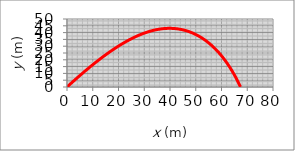
| Category | Series 0 |
|---|---|
| 0.0 | 0 |
| 0.24916666666666673 | 0.431 |
| 0.4966791454179944 | 0.858 |
| 0.7425621269103597 | 1.282 |
| 0.9868397756933099 | 1.701 |
| 1.2295357451129643 | 2.117 |
| 1.470673191690599 | 2.53 |
| 1.710274788998455 | 2.939 |
| 1.9483627410537288 | 3.344 |
| 2.1849587952506972 | 3.745 |
| 2.420084254849969 | 4.144 |
| 2.653759991042943 | 4.538 |
| 2.8860064546087085 | 4.93 |
| 3.1168436871798013 | 5.318 |
| 3.346291332132463 | 5.702 |
| 3.5743686451163335 | 6.084 |
| 3.801094504237806 | 6.462 |
| 4.026487419910634 | 6.837 |
| 4.250565544386745 | 7.209 |
| 4.473346680979654 | 7.577 |
| 4.694848292992279 | 7.943 |
| 4.915087512360473 | 8.305 |
| 5.134081148023058 | 8.665 |
| 5.351845694028667 | 9.021 |
| 5.568397337389285 | 9.375 |
| 5.7837519656898975 | 9.726 |
| 5.997925174463292 | 10.073 |
| 6.2109322743386555 | 10.418 |
| 6.422788297972216 | 10.76 |
| 6.633508006767879 | 11.099 |
| 6.843105897395412 | 11.435 |
| 7.051596208113473 | 11.769 |
| 7.258992924904424 | 12.1 |
| 7.46530978742762 | 12.428 |
| 7.670560294797564 | 12.754 |
| 7.874757711193069 | 13.076 |
| 8.077915071303318 | 13.397 |
| 8.280045185616467 | 13.714 |
| 8.481160645556214 | 14.029 |
| 8.681273828471532 | 14.342 |
| 8.880396902484586 | 14.652 |
| 9.078541831201603 | 14.959 |
| 9.275720378291327 | 15.264 |
| 9.471944111935485 | 15.567 |
| 9.667224409155518 | 15.867 |
| 9.861572460019667 | 16.165 |
| 10.05499927173437 | 16.46 |
| 10.247515672623722 | 16.753 |
| 10.439132316000665 | 17.043 |
| 10.6298596839334 | 17.332 |
| 10.819708090910405 | 17.618 |
| 11.008687687407269 | 17.901 |
| 11.196808463358513 | 18.183 |
| 11.38408025153737 | 18.462 |
| 11.570512730846433 | 18.739 |
| 11.756115429521971 | 19.013 |
| 11.940897728254576 | 19.286 |
| 12.124868863228766 | 19.556 |
| 12.308037929084014 | 19.824 |
| 12.490413881799618 | 20.09 |
| 12.672005541505753 | 20.354 |
| 12.852821595222903 | 20.616 |
| 13.032870599531877 | 20.876 |
| 13.212160983176469 | 21.133 |
| 13.390701049600764 | 21.389 |
| 13.568498979423062 | 21.642 |
| 13.745562832848254 | 21.894 |
| 13.921900552020498 | 22.143 |
| 14.097519963317907 | 22.391 |
| 14.272428779590959 | 22.636 |
| 14.44663460234624 | 22.88 |
| 14.620144923877113 | 23.121 |
| 14.792967129342816 | 23.361 |
| 14.965108498797468 | 23.599 |
| 15.136576209170407 | 23.835 |
| 15.307377336199217 | 24.068 |
| 15.477518856316797 | 24.3 |
| 15.647007648493727 | 24.531 |
| 15.815850496037198 | 24.759 |
| 15.984054088347696 | 24.985 |
| 16.151625022634594 | 25.21 |
| 16.318569805591796 | 25.433 |
| 16.484894855034508 | 25.654 |
| 16.65060650149819 | 25.873 |
| 16.81571098980071 | 26.09 |
| 16.9802144805687 | 26.306 |
| 17.144123051729043 | 26.52 |
| 17.307442699966426 | 26.732 |
| 17.470179342147894 | 26.943 |
| 17.632338816715208 | 27.151 |
| 17.7939268850459 | 27.358 |
| 17.95494923278381 | 27.563 |
| 18.11541147113993 | 27.767 |
| 18.27531913816426 | 27.969 |
| 18.434677699989507 | 28.169 |
| 18.593492552047245 | 28.368 |
| 18.751769020257328 | 28.565 |
| 18.90951236219116 | 28.76 |
| 19.066727768209525 | 28.953 |
| 19.223420362575602 | 29.145 |
| 19.37959520454376 | 29.336 |
| 19.53525728942476 | 29.525 |
| 19.690411549627928 | 29.712 |
| 19.84506285568089 | 29.897 |
| 19.999216017227372 | 30.081 |
| 20.15287578400363 | 30.264 |
| 20.30604684679403 | 30.445 |
| 20.45873383836624 | 30.624 |
| 20.610941334386567 | 30.802 |
| 20.76267385431588 | 30.978 |
| 20.913935862286593 | 31.153 |
| 21.064731767961135 | 31.326 |
| 21.215065927372372 | 31.498 |
| 21.364942643746364 | 31.668 |
| 21.514366168307895 | 31.837 |
| 21.663340701069146 | 32.004 |
| 21.81187039160193 | 32.17 |
| 21.959959339793826 | 32.334 |
| 22.107611596588615 | 32.497 |
| 22.254831164711323 | 32.658 |
| 22.401621999378275 | 32.818 |
| 22.54798800899244 | 32.976 |
| 22.69393305582443 | 33.133 |
| 22.839460956679446 | 33.289 |
| 22.984575483550486 | 33.443 |
| 23.12928036425814 | 33.596 |
| 23.273579283077193 | 33.747 |
| 23.41747588135042 | 33.897 |
| 23.56097375808974 | 34.046 |
| 23.704076470565095 | 34.193 |
| 23.846787534881248 | 34.339 |
| 23.989110426542776 | 34.483 |
| 24.13104858100752 | 34.626 |
| 24.272605394228695 | 34.768 |
| 24.413784223185953 | 34.908 |
| 24.554588386405552 | 35.047 |
| 24.69502116446992 | 35.184 |
| 24.835085800516797 | 35.321 |
| 24.97478550072817 | 35.456 |
| 25.11412343480921 | 35.589 |
| 25.253102736457393 | 35.722 |
| 25.39172650382206 | 35.852 |
| 25.52999779995451 | 35.982 |
| 25.667919653248898 | 36.11 |
| 25.805495057874065 | 36.237 |
| 25.942726974196518 | 36.363 |
| 26.079618329194677 | 36.488 |
| 26.21617201686461 | 36.611 |
| 26.352390898617408 | 36.733 |
| 26.488277803668304 | 36.853 |
| 26.62383552941779 | 36.973 |
| 26.75906684182479 | 37.091 |
| 26.893974475772108 | 37.207 |
| 27.028561135424237 | 37.323 |
| 27.16282949457772 | 37.437 |
| 27.29678219700417 | 37.55 |
| 27.430421856786086 | 37.662 |
| 27.56375105864564 | 37.773 |
| 27.696772358266482 | 37.882 |
| 27.82948828260877 | 37.99 |
| 27.9619013302175 | 38.097 |
| 28.094013971524284 | 38.203 |
| 28.225828649142667 | 38.307 |
| 28.35734777815713 | 38.41 |
| 28.488573746405876 | 38.512 |
| 28.619508914757503 | 38.613 |
| 28.750155617381694 | 38.713 |
| 28.880516162014008 | 38.811 |
| 29.010592830214904 | 38.908 |
| 29.140387877623088 | 39.004 |
| 29.269903534203266 | 39.099 |
| 29.39914200448844 | 39.193 |
| 29.528105467816825 | 39.285 |
| 29.65679607856348 | 39.376 |
| 29.78521596636676 | 39.466 |
| 29.913367236349675 | 39.555 |
| 30.041251969336262 | 39.643 |
| 30.168872222063033 | 39.73 |
| 30.296230027385633 | 39.815 |
| 30.423327394480754 | 39.899 |
| 30.550166309043433 | 39.983 |
| 30.676748733479773 | 40.065 |
| 30.803076607095235 | 40.145 |
| 30.929151846278536 | 40.225 |
| 31.05497634468126 | 40.304 |
| 31.18055197339328 | 40.381 |
| 31.305880581114025 | 40.457 |
| 31.430963994319754 | 40.533 |
| 31.55580401742685 | 40.607 |
| 31.680402432951258 | 40.68 |
| 31.80476100166412 | 40.751 |
| 31.92888146274372 | 40.822 |
| 32.05276553392382 | 40.892 |
| 32.17641491163841 | 40.96 |
| 32.29983127116307 | 41.028 |
| 32.4230162667529 | 41.094 |
| 32.545971531777184 | 41.159 |
| 32.668698678850845 | 41.223 |
| 32.79119929996276 | 41.286 |
| 32.91347496660107 | 41.348 |
| 33.03552722987546 | 41.408 |
| 33.157357620636645 | 41.468 |
| 33.27896764959299 | 41.527 |
| 33.40035880742448 | 41.584 |
| 33.52153256489403 | 41.641 |
| 33.64249037295627 | 41.696 |
| 33.763233662863875 | 41.75 |
| 33.88376384627155 | 41.803 |
| 34.00408231533767 | 41.855 |
| 34.124190442823824 | 41.907 |
| 34.244089582192174 | 41.956 |
| 34.36378106770082 | 42.005 |
| 34.48326621449727 | 42.053 |
| 34.60254631871003 | 42.1 |
| 34.72162265753847 | 42.146 |
| 34.840496489341 | 42.19 |
| 34.959169053721745 | 42.234 |
| 35.07764157161568 | 42.276 |
| 35.19591524537241 | 42.318 |
| 35.313991258838676 | 42.358 |
| 35.43187077743961 | 42.398 |
| 35.54955494825897 | 42.436 |
| 35.66704490011829 | 42.473 |
| 35.784341743655155 | 42.51 |
| 35.90144657140063 | 42.545 |
| 36.01836045785602 | 42.579 |
| 36.13508445956891 | 42.612 |
| 36.25161961520873 | 42.644 |
| 36.367966945641896 | 42.675 |
| 36.48412745400653 | 42.706 |
| 36.600102125787 | 42.735 |
| 36.71589192888824 | 42.763 |
| 36.83149781371008 | 42.79 |
| 36.94692071322154 | 42.815 |
| 37.06216154303526 | 42.84 |
| 37.17722120148217 | 42.864 |
| 37.29210056968645 | 42.887 |
| 37.40680051164085 | 42.909 |
| 37.521321874282584 | 42.93 |
| 37.63566548756968 | 42.95 |
| 37.7498321645581 | 42.969 |
| 37.86382270147951 | 42.986 |
| 37.97763787781997 | 43.003 |
| 38.09127845639944 | 43.019 |
| 38.20474518345236 | 43.034 |
| 38.31803878870923 | 43.048 |
| 38.43115998547941 | 43.061 |
| 38.54410947073506 | 43.072 |
| 38.65688792519641 | 43.083 |
| 38.7694960134184 | 43.093 |
| 38.88193438387872 | 43.102 |
| 38.99420366906737 | 43.11 |
| 39.106304485577695 | 43.117 |
| 39.21823743419915 | 43.122 |
| 39.33000310001162 | 43.127 |
| 39.441602052481485 | 43.131 |
| 39.553034845559466 | 43.134 |
| 39.66430201778027 | 43.136 |
| 39.775404092364056 | 43.137 |
| 39.88634157731981 | 43.137 |
| 39.997114965550644 | 43.136 |
| 40.10772473496102 | 43.134 |
| 40.21817134856594 | 43.131 |
| 40.32845525460219 | 43.127 |
| 40.438576886641535 | 43.122 |
| 40.548536663705974 | 43.116 |
| 40.65833499038504 | 43.109 |
| 40.76797225695513 | 43.101 |
| 40.87744883950089 | 43.092 |
| 40.98676510003868 | 43.082 |
| 41.095921386642026 | 43.072 |
| 41.20491803356916 | 43.06 |
| 41.31375536139255 | 43.047 |
| 41.42243367713048 | 43.034 |
| 41.530953274380536 | 43.019 |
| 41.63931443345516 | 43.003 |
| 41.74751742151904 | 42.987 |
| 41.85556249272848 | 42.969 |
| 41.963449888372594 | 42.951 |
| 42.07117983701636 | 42.932 |
| 42.178752554645456 | 42.911 |
| 42.28616824481284 | 42.89 |
| 42.39342709878705 | 42.868 |
| 42.50052929570213 | 42.845 |
| 42.60747500270919 | 42.82 |
| 42.71426437512947 | 42.795 |
| 42.82089755660894 | 42.769 |
| 42.927374679274315 | 42.742 |
| 43.0336958638904 | 42.715 |
| 43.13986122001881 | 42.686 |
| 43.24587084617786 | 42.656 |
| 43.3517248300037 | 42.625 |
| 43.457423248412496 | 42.594 |
| 43.56296616776369 | 42.561 |
| 43.6683536440242 | 42.527 |
| 43.77358572293353 | 42.493 |
| 43.87866244016971 | 42.458 |
| 43.98358382151597 | 42.421 |
| 44.0883498830281 | 42.384 |
| 44.19296063120243 | 42.346 |
| 44.29741606314432 | 42.307 |
| 44.40171616673711 | 42.267 |
| 44.505860920811465 | 42.226 |
| 44.60985029531503 | 42.184 |
| 44.71368425148229 | 42.141 |
| 44.81736274200467 | 42.098 |
| 44.920885711200626 | 42.053 |
| 45.02425309518584 | 42.008 |
| 45.12746482204333 | 41.961 |
| 45.23052081199344 | 41.914 |
| 45.33342097756367 | 41.866 |
| 45.4361652237582 | 41.816 |
| 45.53875344822716 | 41.766 |
| 45.64118554143545 | 41.715 |
| 45.74346138683113 | 41.664 |
| 45.84558086101335 | 41.611 |
| 45.94754383389963 | 41.557 |
| 46.04935016889254 | 41.503 |
| 46.15099972304569 | 41.447 |
| 46.25249234722901 | 41.391 |
| 46.35382788629314 | 41.334 |
| 46.455006179233074 | 41.275 |
| 46.556027059350804 | 41.216 |
| 46.65689035441708 | 41.157 |
| 46.75759588683213 | 41.096 |
| 46.85814347378534 | 41.034 |
| 46.95853292741386 | 40.972 |
| 47.05876405496006 | 40.908 |
| 47.15883665892779 | 40.844 |
| 47.25875053723749 | 40.779 |
| 47.358505483379986 | 40.713 |
| 47.458101286569025 | 40.646 |
| 47.557537731892495 | 40.578 |
| 47.65681460046229 | 40.509 |
| 47.755931669562784 | 40.44 |
| 47.85488871279792 | 40.369 |
| 47.95368550023684 | 40.298 |
| 48.052321798558026 | 40.226 |
| 48.15079737119205 | 40.153 |
| 48.2491119784627 | 40.079 |
| 48.347265377726664 | 40.004 |
| 48.445257323511605 | 39.928 |
| 48.54308756765272 | 39.852 |
| 48.64075585942769 | 39.775 |
| 48.73826194569004 | 39.697 |
| 48.83560557100089 | 39.618 |
| 48.93278647775908 | 39.538 |
| 49.029804406329674 | 39.457 |
| 49.1266590951708 | 39.375 |
| 49.22335028095887 | 39.293 |
| 49.3198776987121 | 39.21 |
| 49.4162410819124 | 39.126 |
| 49.51244016262561 | 39.041 |
| 49.60847467161999 | 38.955 |
| 49.70434433848311 | 38.869 |
| 49.80004889173704 | 38.781 |
| 49.89558805895182 | 38.693 |
| 49.990961566857315 | 38.604 |
| 50.08616914145334 | 38.514 |
| 50.18121050811813 | 38.423 |
| 50.27608539171513 | 38.332 |
| 50.37079351669813 | 38.239 |
| 50.46533460721469 | 38.146 |
| 50.55970838720795 | 38.052 |
| 50.653914580516734 | 37.958 |
| 50.74795291097406 | 37.862 |
| 50.841823102503916 | 37.766 |
| 50.93552487921651 | 37.668 |
| 51.02905796550178 | 37.57 |
| 51.12242208612134 | 37.471 |
| 51.21561696629881 | 37.372 |
| 51.30864233180851 | 37.271 |
| 51.40149790906257 | 37.17 |
| 51.49418342519647 | 37.068 |
| 51.586698608152965 | 36.965 |
| 51.67904318676448 | 36.862 |
| 51.77121689083394 | 36.757 |
| 51.86321945121403 | 36.652 |
| 51.95505059988494 | 36.546 |
| 52.04671007003061 | 36.44 |
| 52.13819759611342 | 36.332 |
| 52.22951291394742 | 36.224 |
| 52.32065576077003 | 36.115 |
| 52.41162587531235 | 36.005 |
| 52.50242299786792 | 35.894 |
| 52.593046870360055 | 35.783 |
| 52.683497236407824 | 35.671 |
| 52.773773841390486 | 35.558 |
| 52.86387643251061 | 35.444 |
| 52.95380475885577 | 35.33 |
| 53.04355857145885 | 35.214 |
| 53.13313762335702 | 35.098 |
| 53.222541669649324 | 34.982 |
| 53.31177046755292 | 34.864 |
| 53.400823776458054 | 34.746 |
| 53.48970135798168 | 34.627 |
| 53.578402976019774 | 34.507 |
| 53.6669283967984 | 34.387 |
| 53.75527738892348 | 34.266 |
| 53.84344972342935 | 34.144 |
| 53.93144517382602 | 34.021 |
| 54.01926351614526 | 33.898 |
| 54.106904528985424 | 33.774 |
| 54.194367993555154 | 33.649 |
| 54.2816536937158 | 33.523 |
| 54.36876141602277 | 33.397 |
| 54.45569094976564 | 33.27 |
| 54.542442087007196 | 33.142 |
| 54.62901462262129 | 33.014 |
| 54.71540835432964 | 32.885 |
| 54.80162308273745 | 32.755 |
| 54.88765861136805 | 32.624 |
| 54.973514746696374 | 32.493 |
| 55.059191298181425 | 32.361 |
| 55.14468807829768 | 32.228 |
| 55.2300049025655 | 32.095 |
| 55.315141589580435 | 31.961 |
| 55.40009796104165 | 31.826 |
| 55.48487384177926 | 31.69 |
| 55.569469059780715 | 31.554 |
| 55.65388344621624 | 31.417 |
| 55.73811683546334 | 31.28 |
| 55.82216906513029 | 31.142 |
| 55.906039976078794 | 31.003 |
| 55.98972941244567 | 30.863 |
| 56.07323722166366 | 30.723 |
| 56.156563254481355 | 30.582 |
| 56.23970736498222 | 30.44 |
| 56.32266941060283 | 30.298 |
| 56.405449252150134 | 30.155 |
| 56.48804675381802 | 30.011 |
| 56.570461783202944 | 29.867 |
| 56.65269421131884 | 29.722 |
| 56.734743912611144 | 29.576 |
| 56.81661076497009 | 29.43 |
| 56.898294649743214 | 29.283 |
| 56.979795451747066 | 29.136 |
| 57.06111305927822 | 28.987 |
| 57.14224736412352 | 28.839 |
| 57.223198261569564 | 28.689 |
| 57.30396565041153 | 28.539 |
| 57.38454943296124 | 28.388 |
| 57.46494951505457 | 28.237 |
| 57.54516580605815 | 28.085 |
| 57.6251982188754 | 27.932 |
| 57.70504666995189 | 27.779 |
| 57.78471107928009 | 27.625 |
| 57.864191370403425 | 27.47 |
| 57.943487470419704 | 27.315 |
| 58.022599309983995 | 27.159 |
| 58.10152682331081 | 27.003 |
| 58.18026994817574 | 26.846 |
| 58.25882862591646 | 26.688 |
| 58.3372028014332 | 26.53 |
| 58.41539242318863 | 26.371 |
| 58.49339744320715 | 26.211 |
| 58.571217817073716 | 26.051 |
| 58.64885350393202 | 25.891 |
| 58.72630446648221 | 25.729 |
| 58.803570670978104 | 25.567 |
| 58.880652087223794 | 25.405 |
| 58.95754868856989 | 25.242 |
| 59.03426045190913 | 25.078 |
| 59.110787357671626 | 24.914 |
| 59.18712938981956 | 24.749 |
| 59.26328653584144 | 24.584 |
| 59.33925878674589 | 24.418 |
| 59.41504613705501 | 24.251 |
| 59.49064858479729 | 24.084 |
| 59.566066131500094 | 23.916 |
| 59.6412987821817 | 23.748 |
| 59.71634654534296 | 23.579 |
| 59.79120943295854 | 23.41 |
| 59.86588746046777 | 23.24 |
| 59.94038064676508 | 23.07 |
| 60.0146890141901 | 22.898 |
| 60.08881258851733 | 22.727 |
| 60.162751398945524 | 22.555 |
| 60.23650547808663 | 22.382 |
| 60.310074861954426 | 22.209 |
| 60.38345958995284 | 22.035 |
| 60.45665970486389 | 21.86 |
| 60.52967525283528 | 21.686 |
| 60.60250628336778 | 21.51 |
| 60.67515284930216 | 21.334 |
| 60.747615006805916 | 21.158 |
| 60.81989281535967 | 20.981 |
| 60.89198633774327 | 20.803 |
| 60.9638956400216 | 20.625 |
| 61.035620791530135 | 20.446 |
| 61.10716186486024 | 20.267 |
| 61.17851893584414 | 20.088 |
| 61.24969208353972 | 19.907 |
| 61.320681390215 | 19.727 |
| 61.39148694133242 | 19.545 |
| 61.46210882553285 | 19.364 |
| 61.532547134619406 | 19.181 |
| 61.602801963541 | 18.999 |
| 61.67287341037571 | 18.816 |
| 61.7427615763139 | 18.632 |
| 61.8124665656412 | 18.448 |
| 61.881988485721195 | 18.263 |
| 61.95132744697797 | 18.078 |
| 62.02048356287848 | 17.892 |
| 62.08945694991473 | 17.706 |
| 62.15824772758572 | 17.519 |
| 62.226856018379316 | 17.332 |
| 62.29528194775388 | 17.144 |
| 62.36352564411976 | 16.956 |
| 62.43158723882063 | 16.767 |
| 62.499466866114695 | 16.578 |
| 62.5671646631557 | 16.389 |
| 62.63468076997387 | 16.199 |
| 62.70201532945664 | 16.008 |
| 62.769168487329345 | 15.817 |
| 62.836140392135675 | 15.626 |
| 62.902931195218116 | 15.434 |
| 62.9695410506982 | 15.242 |
| 63.03597011545667 | 15.049 |
| 63.10221854911358 | 14.856 |
| 63.16828651400821 | 14.662 |
| 63.234174175178964 | 14.468 |
| 63.29988170034312 | 14.273 |
| 63.36540925987653 | 14.078 |
| 63.4307570267932 | 13.882 |
| 63.495925176724846 | 13.686 |
| 63.560913887900305 | 13.49 |
| 63.62572334112493 | 13.293 |
| 63.6903537197599 | 13.096 |
| 63.75480520970144 | 12.898 |
| 63.81907799936005 | 12.7 |
| 63.8831722796396 | 12.502 |
| 63.94708824391644 | 12.303 |
| 64.0108260880184 | 12.103 |
| 64.07438601020382 | 11.903 |
| 64.13776821114047 | 11.703 |
| 64.20097289388444 | 11.502 |
| 64.2640002638591 | 11.301 |
| 64.32685052883387 | 11.1 |
| 64.3895238989031 | 10.898 |
| 64.4520205864648 | 10.695 |
| 64.51434080619953 | 10.493 |
| 64.57648477504908 | 10.29 |
| 64.63845271219525 | 10.086 |
| 64.70024483903859 | 9.882 |
| 64.76186137917716 | 9.678 |
| 64.82330255838522 | 9.473 |
| 64.884568604592 | 9.268 |
| 64.94565974786043 | 9.062 |
| 65.00657622036586 | 8.856 |
| 65.0673182563748 | 8.65 |
| 65.12788609222375 | 8.443 |
| 65.18827996629786 | 8.236 |
| 65.2485001190098 | 8.029 |
| 65.30854679277857 | 7.821 |
| 65.36842023200828 | 7.612 |
| 65.42812068306701 | 7.404 |
| 65.48764839426572 | 7.195 |
| 65.54700361583713 | 6.985 |
| 65.60618659991465 | 6.776 |
| 65.6651976005114 | 6.565 |
| 65.72403687349917 | 6.355 |
| 65.78270467658746 | 6.144 |
| 65.84120126930257 | 5.933 |
| 65.89952691296679 | 5.721 |
| 65.95768187067748 | 5.509 |
| 66.01566640728633 | 5.297 |
| 66.07348078937864 | 5.084 |
| 66.1311252852526 | 4.871 |
| 66.18860016489869 | 4.658 |
| 66.24590569997908 | 4.444 |
| 66.30304216380713 | 4.23 |
| 66.36000983132693 | 4.016 |
| 66.41680897909285 | 3.801 |
| 66.47343988524926 | 3.586 |
| 66.5299028295102 | 3.37 |
| 66.58619809313923 | 3.155 |
| 66.64232595892919 | 2.938 |
| 66.6982867111822 | 2.722 |
| 66.75408063568962 | 2.505 |
| 66.8097080197121 | 2.288 |
| 66.86516915195973 | 2.071 |
| 66.92046432257224 | 1.853 |
| 66.97559382309929 | 1.635 |
| 67.0305579464808 | 1.416 |
| 67.08535698702742 | 1.197 |
| 67.13999124040105 | 0.978 |
| 67.19446100359536 | 0.759 |
| 67.24876657491659 | 0.539 |
| 67.3029082539642 | 0.319 |
| 67.3568863416118 | 0.099 |